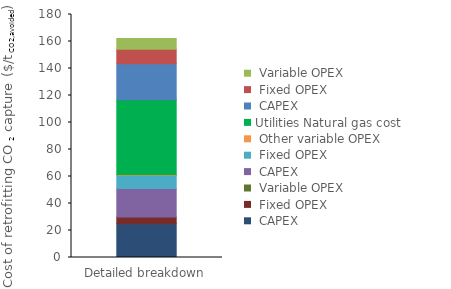
| Category | Interconnecting | Utilities | Series 0 | Series 1 | Series 2 |
|---|---|---|---|---|---|
| 0 | 0 | 55.541 | 26.752 | 10.73 | 7.904 |